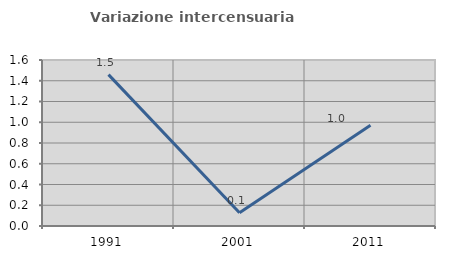
| Category | Variazione intercensuaria annua |
|---|---|
| 1991.0 | 1.459 |
| 2001.0 | 0.128 |
| 2011.0 | 0.97 |